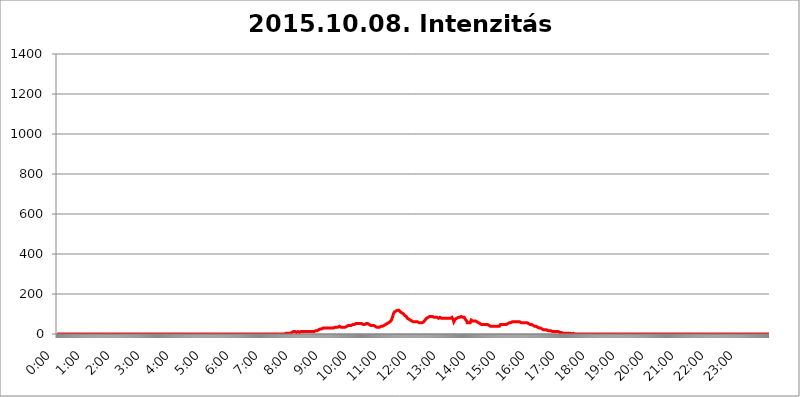
| Category | 2015.10.08. Intenzitás [W/m^2] |
|---|---|
| 0.0 | 0 |
| 0.0006944444444444445 | 0 |
| 0.001388888888888889 | 0 |
| 0.0020833333333333333 | 0 |
| 0.002777777777777778 | 0 |
| 0.003472222222222222 | 0 |
| 0.004166666666666667 | 0 |
| 0.004861111111111111 | 0 |
| 0.005555555555555556 | 0 |
| 0.0062499999999999995 | 0 |
| 0.006944444444444444 | 0 |
| 0.007638888888888889 | 0 |
| 0.008333333333333333 | 0 |
| 0.009027777777777779 | 0 |
| 0.009722222222222222 | 0 |
| 0.010416666666666666 | 0 |
| 0.011111111111111112 | 0 |
| 0.011805555555555555 | 0 |
| 0.012499999999999999 | 0 |
| 0.013194444444444444 | 0 |
| 0.013888888888888888 | 0 |
| 0.014583333333333332 | 0 |
| 0.015277777777777777 | 0 |
| 0.015972222222222224 | 0 |
| 0.016666666666666666 | 0 |
| 0.017361111111111112 | 0 |
| 0.018055555555555557 | 0 |
| 0.01875 | 0 |
| 0.019444444444444445 | 0 |
| 0.02013888888888889 | 0 |
| 0.020833333333333332 | 0 |
| 0.02152777777777778 | 0 |
| 0.022222222222222223 | 0 |
| 0.02291666666666667 | 0 |
| 0.02361111111111111 | 0 |
| 0.024305555555555556 | 0 |
| 0.024999999999999998 | 0 |
| 0.025694444444444447 | 0 |
| 0.02638888888888889 | 0 |
| 0.027083333333333334 | 0 |
| 0.027777777777777776 | 0 |
| 0.02847222222222222 | 0 |
| 0.029166666666666664 | 0 |
| 0.029861111111111113 | 0 |
| 0.030555555555555555 | 0 |
| 0.03125 | 0 |
| 0.03194444444444445 | 0 |
| 0.03263888888888889 | 0 |
| 0.03333333333333333 | 0 |
| 0.034027777777777775 | 0 |
| 0.034722222222222224 | 0 |
| 0.035416666666666666 | 0 |
| 0.036111111111111115 | 0 |
| 0.03680555555555556 | 0 |
| 0.0375 | 0 |
| 0.03819444444444444 | 0 |
| 0.03888888888888889 | 0 |
| 0.03958333333333333 | 0 |
| 0.04027777777777778 | 0 |
| 0.04097222222222222 | 0 |
| 0.041666666666666664 | 0 |
| 0.042361111111111106 | 0 |
| 0.04305555555555556 | 0 |
| 0.043750000000000004 | 0 |
| 0.044444444444444446 | 0 |
| 0.04513888888888889 | 0 |
| 0.04583333333333334 | 0 |
| 0.04652777777777778 | 0 |
| 0.04722222222222222 | 0 |
| 0.04791666666666666 | 0 |
| 0.04861111111111111 | 0 |
| 0.049305555555555554 | 0 |
| 0.049999999999999996 | 0 |
| 0.05069444444444445 | 0 |
| 0.051388888888888894 | 0 |
| 0.052083333333333336 | 0 |
| 0.05277777777777778 | 0 |
| 0.05347222222222222 | 0 |
| 0.05416666666666667 | 0 |
| 0.05486111111111111 | 0 |
| 0.05555555555555555 | 0 |
| 0.05625 | 0 |
| 0.05694444444444444 | 0 |
| 0.057638888888888885 | 0 |
| 0.05833333333333333 | 0 |
| 0.05902777777777778 | 0 |
| 0.059722222222222225 | 0 |
| 0.06041666666666667 | 0 |
| 0.061111111111111116 | 0 |
| 0.06180555555555556 | 0 |
| 0.0625 | 0 |
| 0.06319444444444444 | 0 |
| 0.06388888888888888 | 0 |
| 0.06458333333333334 | 0 |
| 0.06527777777777778 | 0 |
| 0.06597222222222222 | 0 |
| 0.06666666666666667 | 0 |
| 0.06736111111111111 | 0 |
| 0.06805555555555555 | 0 |
| 0.06874999999999999 | 0 |
| 0.06944444444444443 | 0 |
| 0.07013888888888889 | 0 |
| 0.07083333333333333 | 0 |
| 0.07152777777777779 | 0 |
| 0.07222222222222223 | 0 |
| 0.07291666666666667 | 0 |
| 0.07361111111111111 | 0 |
| 0.07430555555555556 | 0 |
| 0.075 | 0 |
| 0.07569444444444444 | 0 |
| 0.0763888888888889 | 0 |
| 0.07708333333333334 | 0 |
| 0.07777777777777778 | 0 |
| 0.07847222222222222 | 0 |
| 0.07916666666666666 | 0 |
| 0.0798611111111111 | 0 |
| 0.08055555555555556 | 0 |
| 0.08125 | 0 |
| 0.08194444444444444 | 0 |
| 0.08263888888888889 | 0 |
| 0.08333333333333333 | 0 |
| 0.08402777777777777 | 0 |
| 0.08472222222222221 | 0 |
| 0.08541666666666665 | 0 |
| 0.08611111111111112 | 0 |
| 0.08680555555555557 | 0 |
| 0.08750000000000001 | 0 |
| 0.08819444444444445 | 0 |
| 0.08888888888888889 | 0 |
| 0.08958333333333333 | 0 |
| 0.09027777777777778 | 0 |
| 0.09097222222222222 | 0 |
| 0.09166666666666667 | 0 |
| 0.09236111111111112 | 0 |
| 0.09305555555555556 | 0 |
| 0.09375 | 0 |
| 0.09444444444444444 | 0 |
| 0.09513888888888888 | 0 |
| 0.09583333333333333 | 0 |
| 0.09652777777777777 | 0 |
| 0.09722222222222222 | 0 |
| 0.09791666666666667 | 0 |
| 0.09861111111111111 | 0 |
| 0.09930555555555555 | 0 |
| 0.09999999999999999 | 0 |
| 0.10069444444444443 | 0 |
| 0.1013888888888889 | 0 |
| 0.10208333333333335 | 0 |
| 0.10277777777777779 | 0 |
| 0.10347222222222223 | 0 |
| 0.10416666666666667 | 0 |
| 0.10486111111111111 | 0 |
| 0.10555555555555556 | 0 |
| 0.10625 | 0 |
| 0.10694444444444444 | 0 |
| 0.1076388888888889 | 0 |
| 0.10833333333333334 | 0 |
| 0.10902777777777778 | 0 |
| 0.10972222222222222 | 0 |
| 0.1111111111111111 | 0 |
| 0.11180555555555556 | 0 |
| 0.11180555555555556 | 0 |
| 0.1125 | 0 |
| 0.11319444444444444 | 0 |
| 0.11388888888888889 | 0 |
| 0.11458333333333333 | 0 |
| 0.11527777777777777 | 0 |
| 0.11597222222222221 | 0 |
| 0.11666666666666665 | 0 |
| 0.1173611111111111 | 0 |
| 0.11805555555555557 | 0 |
| 0.11944444444444445 | 0 |
| 0.12013888888888889 | 0 |
| 0.12083333333333333 | 0 |
| 0.12152777777777778 | 0 |
| 0.12222222222222223 | 0 |
| 0.12291666666666667 | 0 |
| 0.12291666666666667 | 0 |
| 0.12361111111111112 | 0 |
| 0.12430555555555556 | 0 |
| 0.125 | 0 |
| 0.12569444444444444 | 0 |
| 0.12638888888888888 | 0 |
| 0.12708333333333333 | 0 |
| 0.16875 | 0 |
| 0.12847222222222224 | 0 |
| 0.12916666666666668 | 0 |
| 0.12986111111111112 | 0 |
| 0.13055555555555556 | 0 |
| 0.13125 | 0 |
| 0.13194444444444445 | 0 |
| 0.1326388888888889 | 0 |
| 0.13333333333333333 | 0 |
| 0.13402777777777777 | 0 |
| 0.13402777777777777 | 0 |
| 0.13472222222222222 | 0 |
| 0.13541666666666666 | 0 |
| 0.1361111111111111 | 0 |
| 0.13749999999999998 | 0 |
| 0.13819444444444443 | 0 |
| 0.1388888888888889 | 0 |
| 0.13958333333333334 | 0 |
| 0.14027777777777778 | 0 |
| 0.14097222222222222 | 0 |
| 0.14166666666666666 | 0 |
| 0.1423611111111111 | 0 |
| 0.14305555555555557 | 0 |
| 0.14375000000000002 | 0 |
| 0.14444444444444446 | 0 |
| 0.1451388888888889 | 0 |
| 0.1451388888888889 | 0 |
| 0.14652777777777778 | 0 |
| 0.14722222222222223 | 0 |
| 0.14791666666666667 | 0 |
| 0.1486111111111111 | 0 |
| 0.14930555555555555 | 0 |
| 0.15 | 0 |
| 0.15069444444444444 | 0 |
| 0.15138888888888888 | 0 |
| 0.15208333333333332 | 0 |
| 0.15277777777777776 | 0 |
| 0.15347222222222223 | 0 |
| 0.15416666666666667 | 0 |
| 0.15486111111111112 | 0 |
| 0.15555555555555556 | 0 |
| 0.15625 | 0 |
| 0.15694444444444444 | 0 |
| 0.15763888888888888 | 0 |
| 0.15833333333333333 | 0 |
| 0.15902777777777777 | 0 |
| 0.15972222222222224 | 0 |
| 0.16041666666666668 | 0 |
| 0.16111111111111112 | 0 |
| 0.16180555555555556 | 0 |
| 0.1625 | 0 |
| 0.16319444444444445 | 0 |
| 0.1638888888888889 | 0 |
| 0.16458333333333333 | 0 |
| 0.16527777777777777 | 0 |
| 0.16597222222222222 | 0 |
| 0.16666666666666666 | 0 |
| 0.1673611111111111 | 0 |
| 0.16805555555555554 | 0 |
| 0.16874999999999998 | 0 |
| 0.16944444444444443 | 0 |
| 0.17013888888888887 | 0 |
| 0.1708333333333333 | 0 |
| 0.17152777777777775 | 0 |
| 0.17222222222222225 | 0 |
| 0.1729166666666667 | 0 |
| 0.17361111111111113 | 0 |
| 0.17430555555555557 | 0 |
| 0.17500000000000002 | 0 |
| 0.17569444444444446 | 0 |
| 0.1763888888888889 | 0 |
| 0.17708333333333334 | 0 |
| 0.17777777777777778 | 0 |
| 0.17847222222222223 | 0 |
| 0.17916666666666667 | 0 |
| 0.1798611111111111 | 0 |
| 0.18055555555555555 | 0 |
| 0.18125 | 0 |
| 0.18194444444444444 | 0 |
| 0.1826388888888889 | 0 |
| 0.18333333333333335 | 0 |
| 0.1840277777777778 | 0 |
| 0.18472222222222223 | 0 |
| 0.18541666666666667 | 0 |
| 0.18611111111111112 | 0 |
| 0.18680555555555556 | 0 |
| 0.1875 | 0 |
| 0.18819444444444444 | 0 |
| 0.18888888888888888 | 0 |
| 0.18958333333333333 | 0 |
| 0.19027777777777777 | 0 |
| 0.1909722222222222 | 0 |
| 0.19166666666666665 | 0 |
| 0.19236111111111112 | 0 |
| 0.19305555555555554 | 0 |
| 0.19375 | 0 |
| 0.19444444444444445 | 0 |
| 0.1951388888888889 | 0 |
| 0.19583333333333333 | 0 |
| 0.19652777777777777 | 0 |
| 0.19722222222222222 | 0 |
| 0.19791666666666666 | 0 |
| 0.1986111111111111 | 0 |
| 0.19930555555555554 | 0 |
| 0.19999999999999998 | 0 |
| 0.20069444444444443 | 0 |
| 0.20138888888888887 | 0 |
| 0.2020833333333333 | 0 |
| 0.2027777777777778 | 0 |
| 0.2034722222222222 | 0 |
| 0.2041666666666667 | 0 |
| 0.20486111111111113 | 0 |
| 0.20555555555555557 | 0 |
| 0.20625000000000002 | 0 |
| 0.20694444444444446 | 0 |
| 0.2076388888888889 | 0 |
| 0.20833333333333334 | 0 |
| 0.20902777777777778 | 0 |
| 0.20972222222222223 | 0 |
| 0.21041666666666667 | 0 |
| 0.2111111111111111 | 0 |
| 0.21180555555555555 | 0 |
| 0.2125 | 0 |
| 0.21319444444444444 | 0 |
| 0.2138888888888889 | 0 |
| 0.21458333333333335 | 0 |
| 0.2152777777777778 | 0 |
| 0.21597222222222223 | 0 |
| 0.21666666666666667 | 0 |
| 0.21736111111111112 | 0 |
| 0.21805555555555556 | 0 |
| 0.21875 | 0 |
| 0.21944444444444444 | 0 |
| 0.22013888888888888 | 0 |
| 0.22083333333333333 | 0 |
| 0.22152777777777777 | 0 |
| 0.2222222222222222 | 0 |
| 0.22291666666666665 | 0 |
| 0.2236111111111111 | 0 |
| 0.22430555555555556 | 0 |
| 0.225 | 0 |
| 0.22569444444444445 | 0 |
| 0.2263888888888889 | 0 |
| 0.22708333333333333 | 0 |
| 0.22777777777777777 | 0 |
| 0.22847222222222222 | 0 |
| 0.22916666666666666 | 0 |
| 0.2298611111111111 | 0 |
| 0.23055555555555554 | 0 |
| 0.23124999999999998 | 0 |
| 0.23194444444444443 | 0 |
| 0.23263888888888887 | 0 |
| 0.2333333333333333 | 0 |
| 0.2340277777777778 | 0 |
| 0.2347222222222222 | 0 |
| 0.2354166666666667 | 0 |
| 0.23611111111111113 | 0 |
| 0.23680555555555557 | 0 |
| 0.23750000000000002 | 0 |
| 0.23819444444444446 | 0 |
| 0.2388888888888889 | 0 |
| 0.23958333333333334 | 0 |
| 0.24027777777777778 | 0 |
| 0.24097222222222223 | 0 |
| 0.24166666666666667 | 0 |
| 0.2423611111111111 | 0 |
| 0.24305555555555555 | 0 |
| 0.24375 | 0 |
| 0.24444444444444446 | 0 |
| 0.24513888888888888 | 0 |
| 0.24583333333333335 | 0 |
| 0.2465277777777778 | 0 |
| 0.24722222222222223 | 0 |
| 0.24791666666666667 | 0 |
| 0.24861111111111112 | 0 |
| 0.24930555555555556 | 0 |
| 0.25 | 0 |
| 0.25069444444444444 | 0 |
| 0.2513888888888889 | 0 |
| 0.2520833333333333 | 0 |
| 0.25277777777777777 | 0 |
| 0.2534722222222222 | 0 |
| 0.25416666666666665 | 0 |
| 0.2548611111111111 | 0 |
| 0.2555555555555556 | 0 |
| 0.25625000000000003 | 0 |
| 0.2569444444444445 | 0 |
| 0.2576388888888889 | 0 |
| 0.25833333333333336 | 0 |
| 0.2590277777777778 | 0 |
| 0.25972222222222224 | 0 |
| 0.2604166666666667 | 0 |
| 0.2611111111111111 | 0 |
| 0.26180555555555557 | 0 |
| 0.2625 | 0 |
| 0.26319444444444445 | 0 |
| 0.2638888888888889 | 0 |
| 0.26458333333333334 | 0 |
| 0.2652777777777778 | 0 |
| 0.2659722222222222 | 0 |
| 0.26666666666666666 | 0 |
| 0.2673611111111111 | 0 |
| 0.26805555555555555 | 0 |
| 0.26875 | 0 |
| 0.26944444444444443 | 0 |
| 0.2701388888888889 | 0 |
| 0.2708333333333333 | 0 |
| 0.27152777777777776 | 0 |
| 0.2722222222222222 | 0 |
| 0.27291666666666664 | 0 |
| 0.2736111111111111 | 0 |
| 0.2743055555555555 | 0 |
| 0.27499999999999997 | 0 |
| 0.27569444444444446 | 0 |
| 0.27638888888888885 | 0 |
| 0.27708333333333335 | 0 |
| 0.2777777777777778 | 0 |
| 0.27847222222222223 | 0 |
| 0.2791666666666667 | 0 |
| 0.2798611111111111 | 0 |
| 0.28055555555555556 | 0 |
| 0.28125 | 0 |
| 0.28194444444444444 | 0 |
| 0.2826388888888889 | 0 |
| 0.2833333333333333 | 0 |
| 0.28402777777777777 | 0 |
| 0.2847222222222222 | 0 |
| 0.28541666666666665 | 0 |
| 0.28611111111111115 | 0 |
| 0.28680555555555554 | 0 |
| 0.28750000000000003 | 0 |
| 0.2881944444444445 | 0 |
| 0.2888888888888889 | 0 |
| 0.28958333333333336 | 0 |
| 0.2902777777777778 | 0 |
| 0.29097222222222224 | 0 |
| 0.2916666666666667 | 0 |
| 0.2923611111111111 | 0 |
| 0.29305555555555557 | 0 |
| 0.29375 | 0 |
| 0.29444444444444445 | 0 |
| 0.2951388888888889 | 0 |
| 0.29583333333333334 | 0 |
| 0.2965277777777778 | 0 |
| 0.2972222222222222 | 0 |
| 0.29791666666666666 | 0 |
| 0.2986111111111111 | 0 |
| 0.29930555555555555 | 0 |
| 0.3 | 0 |
| 0.30069444444444443 | 0 |
| 0.3013888888888889 | 0 |
| 0.3020833333333333 | 0 |
| 0.30277777777777776 | 0 |
| 0.3034722222222222 | 0 |
| 0.30416666666666664 | 0 |
| 0.3048611111111111 | 0 |
| 0.3055555555555555 | 0 |
| 0.30624999999999997 | 0 |
| 0.3069444444444444 | 0 |
| 0.3076388888888889 | 0 |
| 0.30833333333333335 | 0 |
| 0.3090277777777778 | 0 |
| 0.30972222222222223 | 0 |
| 0.3104166666666667 | 0 |
| 0.3111111111111111 | 0 |
| 0.31180555555555556 | 0 |
| 0.3125 | 0 |
| 0.31319444444444444 | 0 |
| 0.3138888888888889 | 0 |
| 0.3145833333333333 | 0 |
| 0.31527777777777777 | 0 |
| 0.3159722222222222 | 0 |
| 0.31666666666666665 | 0 |
| 0.31736111111111115 | 0 |
| 0.31805555555555554 | 0 |
| 0.31875000000000003 | 0 |
| 0.3194444444444445 | 0 |
| 0.3201388888888889 | 0 |
| 0.32083333333333336 | 3.525 |
| 0.3215277777777778 | 3.525 |
| 0.32222222222222224 | 3.525 |
| 0.3229166666666667 | 3.525 |
| 0.3236111111111111 | 3.525 |
| 0.32430555555555557 | 3.525 |
| 0.325 | 3.525 |
| 0.32569444444444445 | 3.525 |
| 0.3263888888888889 | 3.525 |
| 0.32708333333333334 | 3.525 |
| 0.3277777777777778 | 3.525 |
| 0.3284722222222222 | 7.887 |
| 0.32916666666666666 | 7.887 |
| 0.3298611111111111 | 7.887 |
| 0.33055555555555555 | 7.887 |
| 0.33125 | 12.257 |
| 0.33194444444444443 | 12.257 |
| 0.3326388888888889 | 12.257 |
| 0.3333333333333333 | 12.257 |
| 0.3340277777777778 | 12.257 |
| 0.3347222222222222 | 12.257 |
| 0.3354166666666667 | 7.887 |
| 0.3361111111111111 | 12.257 |
| 0.3368055555555556 | 12.257 |
| 0.33749999999999997 | 12.257 |
| 0.33819444444444446 | 12.257 |
| 0.33888888888888885 | 7.887 |
| 0.33958333333333335 | 7.887 |
| 0.34027777777777773 | 12.257 |
| 0.34097222222222223 | 12.257 |
| 0.3416666666666666 | 12.257 |
| 0.3423611111111111 | 12.257 |
| 0.3430555555555555 | 12.257 |
| 0.34375 | 12.257 |
| 0.3444444444444445 | 12.257 |
| 0.3451388888888889 | 12.257 |
| 0.3458333333333334 | 12.257 |
| 0.34652777777777777 | 12.257 |
| 0.34722222222222227 | 12.257 |
| 0.34791666666666665 | 12.257 |
| 0.34861111111111115 | 12.257 |
| 0.34930555555555554 | 12.257 |
| 0.35000000000000003 | 12.257 |
| 0.3506944444444444 | 12.257 |
| 0.3513888888888889 | 12.257 |
| 0.3520833333333333 | 12.257 |
| 0.3527777777777778 | 12.257 |
| 0.3534722222222222 | 12.257 |
| 0.3541666666666667 | 12.257 |
| 0.3548611111111111 | 12.257 |
| 0.35555555555555557 | 12.257 |
| 0.35625 | 12.257 |
| 0.35694444444444445 | 12.257 |
| 0.3576388888888889 | 12.257 |
| 0.35833333333333334 | 12.257 |
| 0.3590277777777778 | 12.257 |
| 0.3597222222222222 | 12.257 |
| 0.36041666666666666 | 12.257 |
| 0.3611111111111111 | 12.257 |
| 0.36180555555555555 | 16.636 |
| 0.3625 | 16.636 |
| 0.36319444444444443 | 16.636 |
| 0.3638888888888889 | 16.636 |
| 0.3645833333333333 | 16.636 |
| 0.3652777777777778 | 16.636 |
| 0.3659722222222222 | 21.024 |
| 0.3666666666666667 | 21.024 |
| 0.3673611111111111 | 21.024 |
| 0.3680555555555556 | 25.419 |
| 0.36874999999999997 | 25.419 |
| 0.36944444444444446 | 25.419 |
| 0.37013888888888885 | 25.419 |
| 0.37083333333333335 | 25.419 |
| 0.37152777777777773 | 25.419 |
| 0.37222222222222223 | 25.419 |
| 0.3729166666666666 | 29.823 |
| 0.3736111111111111 | 29.823 |
| 0.3743055555555555 | 29.823 |
| 0.375 | 29.823 |
| 0.3756944444444445 | 29.823 |
| 0.3763888888888889 | 29.823 |
| 0.3770833333333334 | 29.823 |
| 0.37777777777777777 | 29.823 |
| 0.37847222222222227 | 29.823 |
| 0.37916666666666665 | 29.823 |
| 0.37986111111111115 | 29.823 |
| 0.38055555555555554 | 29.823 |
| 0.38125000000000003 | 29.823 |
| 0.3819444444444444 | 29.823 |
| 0.3826388888888889 | 29.823 |
| 0.3833333333333333 | 29.823 |
| 0.3840277777777778 | 29.823 |
| 0.3847222222222222 | 29.823 |
| 0.3854166666666667 | 29.823 |
| 0.3861111111111111 | 29.823 |
| 0.38680555555555557 | 29.823 |
| 0.3875 | 29.823 |
| 0.38819444444444445 | 29.823 |
| 0.3888888888888889 | 29.823 |
| 0.38958333333333334 | 34.234 |
| 0.3902777777777778 | 34.234 |
| 0.3909722222222222 | 34.234 |
| 0.39166666666666666 | 34.234 |
| 0.3923611111111111 | 34.234 |
| 0.39305555555555555 | 34.234 |
| 0.39375 | 34.234 |
| 0.39444444444444443 | 34.234 |
| 0.3951388888888889 | 38.653 |
| 0.3958333333333333 | 38.653 |
| 0.3965277777777778 | 34.234 |
| 0.3972222222222222 | 38.653 |
| 0.3979166666666667 | 34.234 |
| 0.3986111111111111 | 34.234 |
| 0.3993055555555556 | 34.234 |
| 0.39999999999999997 | 34.234 |
| 0.40069444444444446 | 34.234 |
| 0.40138888888888885 | 34.234 |
| 0.40208333333333335 | 34.234 |
| 0.40277777777777773 | 34.234 |
| 0.40347222222222223 | 34.234 |
| 0.4041666666666666 | 34.234 |
| 0.4048611111111111 | 38.653 |
| 0.4055555555555555 | 38.653 |
| 0.40625 | 38.653 |
| 0.4069444444444445 | 38.653 |
| 0.4076388888888889 | 38.653 |
| 0.4083333333333334 | 43.079 |
| 0.40902777777777777 | 43.079 |
| 0.40972222222222227 | 43.079 |
| 0.41041666666666665 | 43.079 |
| 0.41111111111111115 | 43.079 |
| 0.41180555555555554 | 43.079 |
| 0.41250000000000003 | 43.079 |
| 0.4131944444444444 | 43.079 |
| 0.4138888888888889 | 43.079 |
| 0.4145833333333333 | 47.511 |
| 0.4152777777777778 | 47.511 |
| 0.4159722222222222 | 47.511 |
| 0.4166666666666667 | 47.511 |
| 0.4173611111111111 | 51.951 |
| 0.41805555555555557 | 51.951 |
| 0.41875 | 51.951 |
| 0.41944444444444445 | 51.951 |
| 0.4201388888888889 | 51.951 |
| 0.42083333333333334 | 51.951 |
| 0.4215277777777778 | 51.951 |
| 0.4222222222222222 | 51.951 |
| 0.42291666666666666 | 51.951 |
| 0.4236111111111111 | 51.951 |
| 0.42430555555555555 | 51.951 |
| 0.425 | 51.951 |
| 0.42569444444444443 | 51.951 |
| 0.4263888888888889 | 51.951 |
| 0.4270833333333333 | 51.951 |
| 0.4277777777777778 | 51.951 |
| 0.4284722222222222 | 47.511 |
| 0.4291666666666667 | 47.511 |
| 0.4298611111111111 | 47.511 |
| 0.4305555555555556 | 47.511 |
| 0.43124999999999997 | 47.511 |
| 0.43194444444444446 | 51.951 |
| 0.43263888888888885 | 51.951 |
| 0.43333333333333335 | 51.951 |
| 0.43402777777777773 | 51.951 |
| 0.43472222222222223 | 51.951 |
| 0.4354166666666666 | 51.951 |
| 0.4361111111111111 | 47.511 |
| 0.4368055555555555 | 47.511 |
| 0.4375 | 47.511 |
| 0.4381944444444445 | 47.511 |
| 0.4388888888888889 | 43.079 |
| 0.4395833333333334 | 43.079 |
| 0.44027777777777777 | 43.079 |
| 0.44097222222222227 | 43.079 |
| 0.44166666666666665 | 43.079 |
| 0.44236111111111115 | 43.079 |
| 0.44305555555555554 | 43.079 |
| 0.44375000000000003 | 43.079 |
| 0.4444444444444444 | 38.653 |
| 0.4451388888888889 | 38.653 |
| 0.4458333333333333 | 38.653 |
| 0.4465277777777778 | 38.653 |
| 0.4472222222222222 | 38.653 |
| 0.4479166666666667 | 34.234 |
| 0.4486111111111111 | 34.234 |
| 0.44930555555555557 | 34.234 |
| 0.45 | 34.234 |
| 0.45069444444444445 | 34.234 |
| 0.4513888888888889 | 34.234 |
| 0.45208333333333334 | 34.234 |
| 0.4527777777777778 | 34.234 |
| 0.4534722222222222 | 34.234 |
| 0.45416666666666666 | 38.653 |
| 0.4548611111111111 | 38.653 |
| 0.45555555555555555 | 38.653 |
| 0.45625 | 38.653 |
| 0.45694444444444443 | 43.079 |
| 0.4576388888888889 | 43.079 |
| 0.4583333333333333 | 43.079 |
| 0.4590277777777778 | 47.511 |
| 0.4597222222222222 | 47.511 |
| 0.4604166666666667 | 47.511 |
| 0.4611111111111111 | 47.511 |
| 0.4618055555555556 | 51.951 |
| 0.46249999999999997 | 51.951 |
| 0.46319444444444446 | 51.951 |
| 0.46388888888888885 | 51.951 |
| 0.46458333333333335 | 56.398 |
| 0.46527777777777773 | 56.398 |
| 0.46597222222222223 | 60.85 |
| 0.4666666666666666 | 60.85 |
| 0.4673611111111111 | 65.31 |
| 0.4680555555555555 | 65.31 |
| 0.46875 | 69.775 |
| 0.4694444444444445 | 74.246 |
| 0.4701388888888889 | 83.205 |
| 0.4708333333333334 | 92.184 |
| 0.47152777777777777 | 101.184 |
| 0.47222222222222227 | 105.69 |
| 0.47291666666666665 | 110.201 |
| 0.47361111111111115 | 110.201 |
| 0.47430555555555554 | 114.716 |
| 0.47500000000000003 | 114.716 |
| 0.4756944444444444 | 119.235 |
| 0.4763888888888889 | 119.235 |
| 0.4770833333333333 | 119.235 |
| 0.4777777777777778 | 119.235 |
| 0.4784722222222222 | 119.235 |
| 0.4791666666666667 | 119.235 |
| 0.4798611111111111 | 114.716 |
| 0.48055555555555557 | 114.716 |
| 0.48125 | 110.201 |
| 0.48194444444444445 | 110.201 |
| 0.4826388888888889 | 105.69 |
| 0.48333333333333334 | 105.69 |
| 0.4840277777777778 | 101.184 |
| 0.4847222222222222 | 101.184 |
| 0.48541666666666666 | 101.184 |
| 0.4861111111111111 | 96.682 |
| 0.48680555555555555 | 96.682 |
| 0.4875 | 92.184 |
| 0.48819444444444443 | 92.184 |
| 0.4888888888888889 | 87.692 |
| 0.4895833333333333 | 87.692 |
| 0.4902777777777778 | 83.205 |
| 0.4909722222222222 | 78.722 |
| 0.4916666666666667 | 78.722 |
| 0.4923611111111111 | 74.246 |
| 0.4930555555555556 | 74.246 |
| 0.49374999999999997 | 69.775 |
| 0.49444444444444446 | 69.775 |
| 0.49513888888888885 | 69.775 |
| 0.49583333333333335 | 65.31 |
| 0.49652777777777773 | 65.31 |
| 0.49722222222222223 | 65.31 |
| 0.4979166666666666 | 65.31 |
| 0.4986111111111111 | 60.85 |
| 0.4993055555555555 | 60.85 |
| 0.5 | 60.85 |
| 0.5006944444444444 | 60.85 |
| 0.5013888888888889 | 60.85 |
| 0.5020833333333333 | 60.85 |
| 0.5027777777777778 | 60.85 |
| 0.5034722222222222 | 60.85 |
| 0.5041666666666667 | 60.85 |
| 0.5048611111111111 | 60.85 |
| 0.5055555555555555 | 60.85 |
| 0.50625 | 56.398 |
| 0.5069444444444444 | 56.398 |
| 0.5076388888888889 | 56.398 |
| 0.5083333333333333 | 56.398 |
| 0.5090277777777777 | 56.398 |
| 0.5097222222222222 | 56.398 |
| 0.5104166666666666 | 56.398 |
| 0.5111111111111112 | 56.398 |
| 0.5118055555555555 | 56.398 |
| 0.5125000000000001 | 56.398 |
| 0.5131944444444444 | 56.398 |
| 0.513888888888889 | 60.85 |
| 0.5145833333333333 | 60.85 |
| 0.5152777777777778 | 65.31 |
| 0.5159722222222222 | 69.775 |
| 0.5166666666666667 | 74.246 |
| 0.517361111111111 | 74.246 |
| 0.5180555555555556 | 78.722 |
| 0.5187499999999999 | 78.722 |
| 0.5194444444444445 | 83.205 |
| 0.5201388888888888 | 83.205 |
| 0.5208333333333334 | 87.692 |
| 0.5215277777777778 | 87.692 |
| 0.5222222222222223 | 87.692 |
| 0.5229166666666667 | 87.692 |
| 0.5236111111111111 | 87.692 |
| 0.5243055555555556 | 87.692 |
| 0.525 | 87.692 |
| 0.5256944444444445 | 87.692 |
| 0.5263888888888889 | 87.692 |
| 0.5270833333333333 | 83.205 |
| 0.5277777777777778 | 83.205 |
| 0.5284722222222222 | 83.205 |
| 0.5291666666666667 | 83.205 |
| 0.5298611111111111 | 83.205 |
| 0.5305555555555556 | 83.205 |
| 0.53125 | 83.205 |
| 0.5319444444444444 | 78.722 |
| 0.5326388888888889 | 83.205 |
| 0.5333333333333333 | 78.722 |
| 0.5340277777777778 | 83.205 |
| 0.5347222222222222 | 78.722 |
| 0.5354166666666667 | 83.205 |
| 0.5361111111111111 | 83.205 |
| 0.5368055555555555 | 83.205 |
| 0.5375 | 83.205 |
| 0.5381944444444444 | 78.722 |
| 0.5388888888888889 | 78.722 |
| 0.5395833333333333 | 78.722 |
| 0.5402777777777777 | 78.722 |
| 0.5409722222222222 | 78.722 |
| 0.5416666666666666 | 78.722 |
| 0.5423611111111112 | 78.722 |
| 0.5430555555555555 | 78.722 |
| 0.5437500000000001 | 78.722 |
| 0.5444444444444444 | 78.722 |
| 0.545138888888889 | 78.722 |
| 0.5458333333333333 | 78.722 |
| 0.5465277777777778 | 78.722 |
| 0.5472222222222222 | 78.722 |
| 0.5479166666666667 | 78.722 |
| 0.548611111111111 | 78.722 |
| 0.5493055555555556 | 78.722 |
| 0.5499999999999999 | 78.722 |
| 0.5506944444444445 | 78.722 |
| 0.5513888888888888 | 78.722 |
| 0.5520833333333334 | 78.722 |
| 0.5527777777777778 | 78.722 |
| 0.5534722222222223 | 83.205 |
| 0.5541666666666667 | 83.205 |
| 0.5548611111111111 | 78.722 |
| 0.5555555555555556 | 69.775 |
| 0.55625 | 60.85 |
| 0.5569444444444445 | 56.398 |
| 0.5576388888888889 | 65.31 |
| 0.5583333333333333 | 74.246 |
| 0.5590277777777778 | 78.722 |
| 0.5597222222222222 | 78.722 |
| 0.5604166666666667 | 78.722 |
| 0.5611111111111111 | 78.722 |
| 0.5618055555555556 | 83.205 |
| 0.5625 | 83.205 |
| 0.5631944444444444 | 83.205 |
| 0.5638888888888889 | 83.205 |
| 0.5645833333333333 | 83.205 |
| 0.5652777777777778 | 83.205 |
| 0.5659722222222222 | 83.205 |
| 0.5666666666666667 | 87.692 |
| 0.5673611111111111 | 87.692 |
| 0.5680555555555555 | 87.692 |
| 0.56875 | 83.205 |
| 0.5694444444444444 | 83.205 |
| 0.5701388888888889 | 83.205 |
| 0.5708333333333333 | 83.205 |
| 0.5715277777777777 | 78.722 |
| 0.5722222222222222 | 74.246 |
| 0.5729166666666666 | 74.246 |
| 0.5736111111111112 | 69.775 |
| 0.5743055555555555 | 65.31 |
| 0.5750000000000001 | 56.398 |
| 0.5756944444444444 | 56.398 |
| 0.576388888888889 | 56.398 |
| 0.5770833333333333 | 56.398 |
| 0.5777777777777778 | 56.398 |
| 0.5784722222222222 | 56.398 |
| 0.5791666666666667 | 56.398 |
| 0.579861111111111 | 60.85 |
| 0.5805555555555556 | 69.775 |
| 0.5812499999999999 | 69.775 |
| 0.5819444444444445 | 65.31 |
| 0.5826388888888888 | 65.31 |
| 0.5833333333333334 | 69.775 |
| 0.5840277777777778 | 65.31 |
| 0.5847222222222223 | 65.31 |
| 0.5854166666666667 | 65.31 |
| 0.5861111111111111 | 65.31 |
| 0.5868055555555556 | 65.31 |
| 0.5875 | 60.85 |
| 0.5881944444444445 | 60.85 |
| 0.5888888888888889 | 60.85 |
| 0.5895833333333333 | 56.398 |
| 0.5902777777777778 | 56.398 |
| 0.5909722222222222 | 56.398 |
| 0.5916666666666667 | 51.951 |
| 0.5923611111111111 | 51.951 |
| 0.5930555555555556 | 51.951 |
| 0.59375 | 51.951 |
| 0.5944444444444444 | 47.511 |
| 0.5951388888888889 | 47.511 |
| 0.5958333333333333 | 47.511 |
| 0.5965277777777778 | 47.511 |
| 0.5972222222222222 | 47.511 |
| 0.5979166666666667 | 47.511 |
| 0.5986111111111111 | 47.511 |
| 0.5993055555555555 | 47.511 |
| 0.6 | 47.511 |
| 0.6006944444444444 | 47.511 |
| 0.6013888888888889 | 47.511 |
| 0.6020833333333333 | 47.511 |
| 0.6027777777777777 | 47.511 |
| 0.6034722222222222 | 47.511 |
| 0.6041666666666666 | 47.511 |
| 0.6048611111111112 | 47.511 |
| 0.6055555555555555 | 43.079 |
| 0.6062500000000001 | 43.079 |
| 0.6069444444444444 | 43.079 |
| 0.607638888888889 | 38.653 |
| 0.6083333333333333 | 38.653 |
| 0.6090277777777778 | 38.653 |
| 0.6097222222222222 | 38.653 |
| 0.6104166666666667 | 38.653 |
| 0.611111111111111 | 38.653 |
| 0.6118055555555556 | 38.653 |
| 0.6124999999999999 | 38.653 |
| 0.6131944444444445 | 38.653 |
| 0.6138888888888888 | 38.653 |
| 0.6145833333333334 | 38.653 |
| 0.6152777777777778 | 38.653 |
| 0.6159722222222223 | 38.653 |
| 0.6166666666666667 | 38.653 |
| 0.6173611111111111 | 38.653 |
| 0.6180555555555556 | 38.653 |
| 0.61875 | 38.653 |
| 0.6194444444444445 | 38.653 |
| 0.6201388888888889 | 38.653 |
| 0.6208333333333333 | 43.079 |
| 0.6215277777777778 | 47.511 |
| 0.6222222222222222 | 47.511 |
| 0.6229166666666667 | 47.511 |
| 0.6236111111111111 | 47.511 |
| 0.6243055555555556 | 47.511 |
| 0.625 | 47.511 |
| 0.6256944444444444 | 47.511 |
| 0.6263888888888889 | 47.511 |
| 0.6270833333333333 | 47.511 |
| 0.6277777777777778 | 47.511 |
| 0.6284722222222222 | 47.511 |
| 0.6291666666666667 | 47.511 |
| 0.6298611111111111 | 47.511 |
| 0.6305555555555555 | 47.511 |
| 0.63125 | 51.951 |
| 0.6319444444444444 | 51.951 |
| 0.6326388888888889 | 51.951 |
| 0.6333333333333333 | 56.398 |
| 0.6340277777777777 | 56.398 |
| 0.6347222222222222 | 56.398 |
| 0.6354166666666666 | 56.398 |
| 0.6361111111111112 | 56.398 |
| 0.6368055555555555 | 56.398 |
| 0.6375000000000001 | 60.85 |
| 0.6381944444444444 | 60.85 |
| 0.638888888888889 | 60.85 |
| 0.6395833333333333 | 60.85 |
| 0.6402777777777778 | 60.85 |
| 0.6409722222222222 | 60.85 |
| 0.6416666666666667 | 65.31 |
| 0.642361111111111 | 60.85 |
| 0.6430555555555556 | 60.85 |
| 0.6437499999999999 | 60.85 |
| 0.6444444444444445 | 60.85 |
| 0.6451388888888888 | 60.85 |
| 0.6458333333333334 | 56.398 |
| 0.6465277777777778 | 60.85 |
| 0.6472222222222223 | 60.85 |
| 0.6479166666666667 | 60.85 |
| 0.6486111111111111 | 60.85 |
| 0.6493055555555556 | 60.85 |
| 0.65 | 56.398 |
| 0.6506944444444445 | 56.398 |
| 0.6513888888888889 | 56.398 |
| 0.6520833333333333 | 56.398 |
| 0.6527777777777778 | 56.398 |
| 0.6534722222222222 | 56.398 |
| 0.6541666666666667 | 56.398 |
| 0.6548611111111111 | 56.398 |
| 0.6555555555555556 | 56.398 |
| 0.65625 | 60.85 |
| 0.6569444444444444 | 56.398 |
| 0.6576388888888889 | 56.398 |
| 0.6583333333333333 | 56.398 |
| 0.6590277777777778 | 56.398 |
| 0.6597222222222222 | 56.398 |
| 0.6604166666666667 | 56.398 |
| 0.6611111111111111 | 51.951 |
| 0.6618055555555555 | 51.951 |
| 0.6625 | 51.951 |
| 0.6631944444444444 | 47.511 |
| 0.6638888888888889 | 47.511 |
| 0.6645833333333333 | 47.511 |
| 0.6652777777777777 | 47.511 |
| 0.6659722222222222 | 47.511 |
| 0.6666666666666666 | 47.511 |
| 0.6673611111111111 | 43.079 |
| 0.6680555555555556 | 43.079 |
| 0.6687500000000001 | 43.079 |
| 0.6694444444444444 | 38.653 |
| 0.6701388888888888 | 38.653 |
| 0.6708333333333334 | 38.653 |
| 0.6715277777777778 | 38.653 |
| 0.6722222222222222 | 34.234 |
| 0.6729166666666666 | 34.234 |
| 0.6736111111111112 | 34.234 |
| 0.6743055555555556 | 34.234 |
| 0.6749999999999999 | 29.823 |
| 0.6756944444444444 | 29.823 |
| 0.6763888888888889 | 29.823 |
| 0.6770833333333334 | 29.823 |
| 0.6777777777777777 | 29.823 |
| 0.6784722222222223 | 25.419 |
| 0.6791666666666667 | 25.419 |
| 0.6798611111111111 | 25.419 |
| 0.6805555555555555 | 25.419 |
| 0.68125 | 25.419 |
| 0.6819444444444445 | 21.024 |
| 0.6826388888888889 | 21.024 |
| 0.6833333333333332 | 21.024 |
| 0.6840277777777778 | 21.024 |
| 0.6847222222222222 | 21.024 |
| 0.6854166666666667 | 21.024 |
| 0.686111111111111 | 21.024 |
| 0.6868055555555556 | 21.024 |
| 0.6875 | 21.024 |
| 0.6881944444444444 | 16.636 |
| 0.688888888888889 | 16.636 |
| 0.6895833333333333 | 16.636 |
| 0.6902777777777778 | 16.636 |
| 0.6909722222222222 | 16.636 |
| 0.6916666666666668 | 16.636 |
| 0.6923611111111111 | 16.636 |
| 0.6930555555555555 | 12.257 |
| 0.69375 | 12.257 |
| 0.6944444444444445 | 12.257 |
| 0.6951388888888889 | 12.257 |
| 0.6958333333333333 | 12.257 |
| 0.6965277777777777 | 12.257 |
| 0.6972222222222223 | 12.257 |
| 0.6979166666666666 | 12.257 |
| 0.6986111111111111 | 12.257 |
| 0.6993055555555556 | 12.257 |
| 0.7000000000000001 | 12.257 |
| 0.7006944444444444 | 12.257 |
| 0.7013888888888888 | 12.257 |
| 0.7020833333333334 | 12.257 |
| 0.7027777777777778 | 12.257 |
| 0.7034722222222222 | 12.257 |
| 0.7041666666666666 | 12.257 |
| 0.7048611111111112 | 7.887 |
| 0.7055555555555556 | 7.887 |
| 0.7062499999999999 | 7.887 |
| 0.7069444444444444 | 7.887 |
| 0.7076388888888889 | 7.887 |
| 0.7083333333333334 | 3.525 |
| 0.7090277777777777 | 3.525 |
| 0.7097222222222223 | 3.525 |
| 0.7104166666666667 | 3.525 |
| 0.7111111111111111 | 3.525 |
| 0.7118055555555555 | 3.525 |
| 0.7125 | 3.525 |
| 0.7131944444444445 | 3.525 |
| 0.7138888888888889 | 3.525 |
| 0.7145833333333332 | 3.525 |
| 0.7152777777777778 | 3.525 |
| 0.7159722222222222 | 3.525 |
| 0.7166666666666667 | 3.525 |
| 0.717361111111111 | 3.525 |
| 0.7180555555555556 | 3.525 |
| 0.71875 | 3.525 |
| 0.7194444444444444 | 3.525 |
| 0.720138888888889 | 3.525 |
| 0.7208333333333333 | 3.525 |
| 0.7215277777777778 | 0 |
| 0.7222222222222222 | 0 |
| 0.7229166666666668 | 0 |
| 0.7236111111111111 | 3.525 |
| 0.7243055555555555 | 0 |
| 0.725 | 0 |
| 0.7256944444444445 | 0 |
| 0.7263888888888889 | 0 |
| 0.7270833333333333 | 0 |
| 0.7277777777777777 | 0 |
| 0.7284722222222223 | 0 |
| 0.7291666666666666 | 0 |
| 0.7298611111111111 | 0 |
| 0.7305555555555556 | 0 |
| 0.7312500000000001 | 0 |
| 0.7319444444444444 | 0 |
| 0.7326388888888888 | 0 |
| 0.7333333333333334 | 0 |
| 0.7340277777777778 | 0 |
| 0.7347222222222222 | 0 |
| 0.7354166666666666 | 0 |
| 0.7361111111111112 | 0 |
| 0.7368055555555556 | 0 |
| 0.7374999999999999 | 0 |
| 0.7381944444444444 | 0 |
| 0.7388888888888889 | 0 |
| 0.7395833333333334 | 0 |
| 0.7402777777777777 | 0 |
| 0.7409722222222223 | 0 |
| 0.7416666666666667 | 0 |
| 0.7423611111111111 | 0 |
| 0.7430555555555555 | 0 |
| 0.74375 | 0 |
| 0.7444444444444445 | 0 |
| 0.7451388888888889 | 0 |
| 0.7458333333333332 | 0 |
| 0.7465277777777778 | 0 |
| 0.7472222222222222 | 0 |
| 0.7479166666666667 | 0 |
| 0.748611111111111 | 0 |
| 0.7493055555555556 | 0 |
| 0.75 | 0 |
| 0.7506944444444444 | 0 |
| 0.751388888888889 | 0 |
| 0.7520833333333333 | 0 |
| 0.7527777777777778 | 0 |
| 0.7534722222222222 | 0 |
| 0.7541666666666668 | 0 |
| 0.7548611111111111 | 0 |
| 0.7555555555555555 | 0 |
| 0.75625 | 0 |
| 0.7569444444444445 | 0 |
| 0.7576388888888889 | 0 |
| 0.7583333333333333 | 0 |
| 0.7590277777777777 | 0 |
| 0.7597222222222223 | 0 |
| 0.7604166666666666 | 0 |
| 0.7611111111111111 | 0 |
| 0.7618055555555556 | 0 |
| 0.7625000000000001 | 0 |
| 0.7631944444444444 | 0 |
| 0.7638888888888888 | 0 |
| 0.7645833333333334 | 0 |
| 0.7652777777777778 | 0 |
| 0.7659722222222222 | 0 |
| 0.7666666666666666 | 0 |
| 0.7673611111111112 | 0 |
| 0.7680555555555556 | 0 |
| 0.7687499999999999 | 0 |
| 0.7694444444444444 | 0 |
| 0.7701388888888889 | 0 |
| 0.7708333333333334 | 0 |
| 0.7715277777777777 | 0 |
| 0.7722222222222223 | 0 |
| 0.7729166666666667 | 0 |
| 0.7736111111111111 | 0 |
| 0.7743055555555555 | 0 |
| 0.775 | 0 |
| 0.7756944444444445 | 0 |
| 0.7763888888888889 | 0 |
| 0.7770833333333332 | 0 |
| 0.7777777777777778 | 0 |
| 0.7784722222222222 | 0 |
| 0.7791666666666667 | 0 |
| 0.779861111111111 | 0 |
| 0.7805555555555556 | 0 |
| 0.78125 | 0 |
| 0.7819444444444444 | 0 |
| 0.782638888888889 | 0 |
| 0.7833333333333333 | 0 |
| 0.7840277777777778 | 0 |
| 0.7847222222222222 | 0 |
| 0.7854166666666668 | 0 |
| 0.7861111111111111 | 0 |
| 0.7868055555555555 | 0 |
| 0.7875 | 0 |
| 0.7881944444444445 | 0 |
| 0.7888888888888889 | 0 |
| 0.7895833333333333 | 0 |
| 0.7902777777777777 | 0 |
| 0.7909722222222223 | 0 |
| 0.7916666666666666 | 0 |
| 0.7923611111111111 | 0 |
| 0.7930555555555556 | 0 |
| 0.7937500000000001 | 0 |
| 0.7944444444444444 | 0 |
| 0.7951388888888888 | 0 |
| 0.7958333333333334 | 0 |
| 0.7965277777777778 | 0 |
| 0.7972222222222222 | 0 |
| 0.7979166666666666 | 0 |
| 0.7986111111111112 | 0 |
| 0.7993055555555556 | 0 |
| 0.7999999999999999 | 0 |
| 0.8006944444444444 | 0 |
| 0.8013888888888889 | 0 |
| 0.8020833333333334 | 0 |
| 0.8027777777777777 | 0 |
| 0.8034722222222223 | 0 |
| 0.8041666666666667 | 0 |
| 0.8048611111111111 | 0 |
| 0.8055555555555555 | 0 |
| 0.80625 | 0 |
| 0.8069444444444445 | 0 |
| 0.8076388888888889 | 0 |
| 0.8083333333333332 | 0 |
| 0.8090277777777778 | 0 |
| 0.8097222222222222 | 0 |
| 0.8104166666666667 | 0 |
| 0.811111111111111 | 0 |
| 0.8118055555555556 | 0 |
| 0.8125 | 0 |
| 0.8131944444444444 | 0 |
| 0.813888888888889 | 0 |
| 0.8145833333333333 | 0 |
| 0.8152777777777778 | 0 |
| 0.8159722222222222 | 0 |
| 0.8166666666666668 | 0 |
| 0.8173611111111111 | 0 |
| 0.8180555555555555 | 0 |
| 0.81875 | 0 |
| 0.8194444444444445 | 0 |
| 0.8201388888888889 | 0 |
| 0.8208333333333333 | 0 |
| 0.8215277777777777 | 0 |
| 0.8222222222222223 | 0 |
| 0.8229166666666666 | 0 |
| 0.8236111111111111 | 0 |
| 0.8243055555555556 | 0 |
| 0.8250000000000001 | 0 |
| 0.8256944444444444 | 0 |
| 0.8263888888888888 | 0 |
| 0.8270833333333334 | 0 |
| 0.8277777777777778 | 0 |
| 0.8284722222222222 | 0 |
| 0.8291666666666666 | 0 |
| 0.8298611111111112 | 0 |
| 0.8305555555555556 | 0 |
| 0.8312499999999999 | 0 |
| 0.8319444444444444 | 0 |
| 0.8326388888888889 | 0 |
| 0.8333333333333334 | 0 |
| 0.8340277777777777 | 0 |
| 0.8347222222222223 | 0 |
| 0.8354166666666667 | 0 |
| 0.8361111111111111 | 0 |
| 0.8368055555555555 | 0 |
| 0.8375 | 0 |
| 0.8381944444444445 | 0 |
| 0.8388888888888889 | 0 |
| 0.8395833333333332 | 0 |
| 0.8402777777777778 | 0 |
| 0.8409722222222222 | 0 |
| 0.8416666666666667 | 0 |
| 0.842361111111111 | 0 |
| 0.8430555555555556 | 0 |
| 0.84375 | 0 |
| 0.8444444444444444 | 0 |
| 0.845138888888889 | 0 |
| 0.8458333333333333 | 0 |
| 0.8465277777777778 | 0 |
| 0.8472222222222222 | 0 |
| 0.8479166666666668 | 0 |
| 0.8486111111111111 | 0 |
| 0.8493055555555555 | 0 |
| 0.85 | 0 |
| 0.8506944444444445 | 0 |
| 0.8513888888888889 | 0 |
| 0.8520833333333333 | 0 |
| 0.8527777777777777 | 0 |
| 0.8534722222222223 | 0 |
| 0.8541666666666666 | 0 |
| 0.8548611111111111 | 0 |
| 0.8555555555555556 | 0 |
| 0.8562500000000001 | 0 |
| 0.8569444444444444 | 0 |
| 0.8576388888888888 | 0 |
| 0.8583333333333334 | 0 |
| 0.8590277777777778 | 0 |
| 0.8597222222222222 | 0 |
| 0.8604166666666666 | 0 |
| 0.8611111111111112 | 0 |
| 0.8618055555555556 | 0 |
| 0.8624999999999999 | 0 |
| 0.8631944444444444 | 0 |
| 0.8638888888888889 | 0 |
| 0.8645833333333334 | 0 |
| 0.8652777777777777 | 0 |
| 0.8659722222222223 | 0 |
| 0.8666666666666667 | 0 |
| 0.8673611111111111 | 0 |
| 0.8680555555555555 | 0 |
| 0.86875 | 0 |
| 0.8694444444444445 | 0 |
| 0.8701388888888889 | 0 |
| 0.8708333333333332 | 0 |
| 0.8715277777777778 | 0 |
| 0.8722222222222222 | 0 |
| 0.8729166666666667 | 0 |
| 0.873611111111111 | 0 |
| 0.8743055555555556 | 0 |
| 0.875 | 0 |
| 0.8756944444444444 | 0 |
| 0.876388888888889 | 0 |
| 0.8770833333333333 | 0 |
| 0.8777777777777778 | 0 |
| 0.8784722222222222 | 0 |
| 0.8791666666666668 | 0 |
| 0.8798611111111111 | 0 |
| 0.8805555555555555 | 0 |
| 0.88125 | 0 |
| 0.8819444444444445 | 0 |
| 0.8826388888888889 | 0 |
| 0.8833333333333333 | 0 |
| 0.8840277777777777 | 0 |
| 0.8847222222222223 | 0 |
| 0.8854166666666666 | 0 |
| 0.8861111111111111 | 0 |
| 0.8868055555555556 | 0 |
| 0.8875000000000001 | 0 |
| 0.8881944444444444 | 0 |
| 0.8888888888888888 | 0 |
| 0.8895833333333334 | 0 |
| 0.8902777777777778 | 0 |
| 0.8909722222222222 | 0 |
| 0.8916666666666666 | 0 |
| 0.8923611111111112 | 0 |
| 0.8930555555555556 | 0 |
| 0.8937499999999999 | 0 |
| 0.8944444444444444 | 0 |
| 0.8951388888888889 | 0 |
| 0.8958333333333334 | 0 |
| 0.8965277777777777 | 0 |
| 0.8972222222222223 | 0 |
| 0.8979166666666667 | 0 |
| 0.8986111111111111 | 0 |
| 0.8993055555555555 | 0 |
| 0.9 | 0 |
| 0.9006944444444445 | 0 |
| 0.9013888888888889 | 0 |
| 0.9020833333333332 | 0 |
| 0.9027777777777778 | 0 |
| 0.9034722222222222 | 0 |
| 0.9041666666666667 | 0 |
| 0.904861111111111 | 0 |
| 0.9055555555555556 | 0 |
| 0.90625 | 0 |
| 0.9069444444444444 | 0 |
| 0.907638888888889 | 0 |
| 0.9083333333333333 | 0 |
| 0.9090277777777778 | 0 |
| 0.9097222222222222 | 0 |
| 0.9104166666666668 | 0 |
| 0.9111111111111111 | 0 |
| 0.9118055555555555 | 0 |
| 0.9125 | 0 |
| 0.9131944444444445 | 0 |
| 0.9138888888888889 | 0 |
| 0.9145833333333333 | 0 |
| 0.9152777777777777 | 0 |
| 0.9159722222222223 | 0 |
| 0.9166666666666666 | 0 |
| 0.9173611111111111 | 0 |
| 0.9180555555555556 | 0 |
| 0.9187500000000001 | 0 |
| 0.9194444444444444 | 0 |
| 0.9201388888888888 | 0 |
| 0.9208333333333334 | 0 |
| 0.9215277777777778 | 0 |
| 0.9222222222222222 | 0 |
| 0.9229166666666666 | 0 |
| 0.9236111111111112 | 0 |
| 0.9243055555555556 | 0 |
| 0.9249999999999999 | 0 |
| 0.9256944444444444 | 0 |
| 0.9263888888888889 | 0 |
| 0.9270833333333334 | 0 |
| 0.9277777777777777 | 0 |
| 0.9284722222222223 | 0 |
| 0.9291666666666667 | 0 |
| 0.9298611111111111 | 0 |
| 0.9305555555555555 | 0 |
| 0.93125 | 0 |
| 0.9319444444444445 | 0 |
| 0.9326388888888889 | 0 |
| 0.9333333333333332 | 0 |
| 0.9340277777777778 | 0 |
| 0.9347222222222222 | 0 |
| 0.9354166666666667 | 0 |
| 0.936111111111111 | 0 |
| 0.9368055555555556 | 0 |
| 0.9375 | 0 |
| 0.9381944444444444 | 0 |
| 0.938888888888889 | 0 |
| 0.9395833333333333 | 0 |
| 0.9402777777777778 | 0 |
| 0.9409722222222222 | 0 |
| 0.9416666666666668 | 0 |
| 0.9423611111111111 | 0 |
| 0.9430555555555555 | 0 |
| 0.94375 | 0 |
| 0.9444444444444445 | 0 |
| 0.9451388888888889 | 0 |
| 0.9458333333333333 | 0 |
| 0.9465277777777777 | 0 |
| 0.9472222222222223 | 0 |
| 0.9479166666666666 | 0 |
| 0.9486111111111111 | 0 |
| 0.9493055555555556 | 0 |
| 0.9500000000000001 | 0 |
| 0.9506944444444444 | 0 |
| 0.9513888888888888 | 0 |
| 0.9520833333333334 | 0 |
| 0.9527777777777778 | 0 |
| 0.9534722222222222 | 0 |
| 0.9541666666666666 | 0 |
| 0.9548611111111112 | 0 |
| 0.9555555555555556 | 0 |
| 0.9562499999999999 | 0 |
| 0.9569444444444444 | 0 |
| 0.9576388888888889 | 0 |
| 0.9583333333333334 | 0 |
| 0.9590277777777777 | 0 |
| 0.9597222222222223 | 0 |
| 0.9604166666666667 | 0 |
| 0.9611111111111111 | 0 |
| 0.9618055555555555 | 0 |
| 0.9625 | 0 |
| 0.9631944444444445 | 0 |
| 0.9638888888888889 | 0 |
| 0.9645833333333332 | 0 |
| 0.9652777777777778 | 0 |
| 0.9659722222222222 | 0 |
| 0.9666666666666667 | 0 |
| 0.967361111111111 | 0 |
| 0.9680555555555556 | 0 |
| 0.96875 | 0 |
| 0.9694444444444444 | 0 |
| 0.970138888888889 | 0 |
| 0.9708333333333333 | 0 |
| 0.9715277777777778 | 0 |
| 0.9722222222222222 | 0 |
| 0.9729166666666668 | 0 |
| 0.9736111111111111 | 0 |
| 0.9743055555555555 | 0 |
| 0.975 | 0 |
| 0.9756944444444445 | 0 |
| 0.9763888888888889 | 0 |
| 0.9770833333333333 | 0 |
| 0.9777777777777777 | 0 |
| 0.9784722222222223 | 0 |
| 0.9791666666666666 | 0 |
| 0.9798611111111111 | 0 |
| 0.9805555555555556 | 0 |
| 0.9812500000000001 | 0 |
| 0.9819444444444444 | 0 |
| 0.9826388888888888 | 0 |
| 0.9833333333333334 | 0 |
| 0.9840277777777778 | 0 |
| 0.9847222222222222 | 0 |
| 0.9854166666666666 | 0 |
| 0.9861111111111112 | 0 |
| 0.9868055555555556 | 0 |
| 0.9874999999999999 | 0 |
| 0.9881944444444444 | 0 |
| 0.9888888888888889 | 0 |
| 0.9895833333333334 | 0 |
| 0.9902777777777777 | 0 |
| 0.9909722222222223 | 0 |
| 0.9916666666666667 | 0 |
| 0.9923611111111111 | 0 |
| 0.9930555555555555 | 0 |
| 0.99375 | 0 |
| 0.9944444444444445 | 0 |
| 0.9951388888888889 | 0 |
| 0.9958333333333332 | 0 |
| 0.9965277777777778 | 0 |
| 0.9972222222222222 | 0 |
| 0.9979166666666667 | 0 |
| 0.998611111111111 | 0 |
| 0.9993055555555556 | 0 |